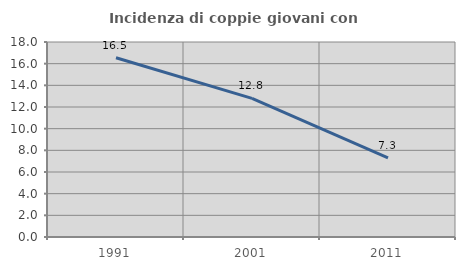
| Category | Incidenza di coppie giovani con figli |
|---|---|
| 1991.0 | 16.544 |
| 2001.0 | 12.796 |
| 2011.0 | 7.307 |